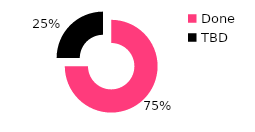
| Category | Series 0 |
|---|---|
| Done | 0.75 |
| TBD | 0.25 |